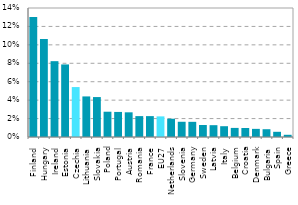
| Category | Series 0 |
|---|---|
| Finland | 0.13 |
| Hungary | 0.106 |
| Ireland | 0.082 |
| Estonia | 0.079 |
| Czechia | 0.054 |
| Lithuania | 0.044 |
| Slovakia | 0.043 |
| Poland | 0.027 |
| Portugal | 0.027 |
| Austria | 0.027 |
| Romania | 0.023 |
| France | 0.023 |
| EU27 | 0.022 |
| Netherlands | 0.02 |
| Slovenia | 0.017 |
| Germany | 0.016 |
| Sweden | 0.013 |
| Latvia | 0.013 |
| Italy | 0.012 |
| Belgium | 0.01 |
| Croatia | 0.01 |
| Denmark | 0.009 |
| Bulgaria | 0.008 |
| Spain | 0.006 |
| Greece | 0.002 |